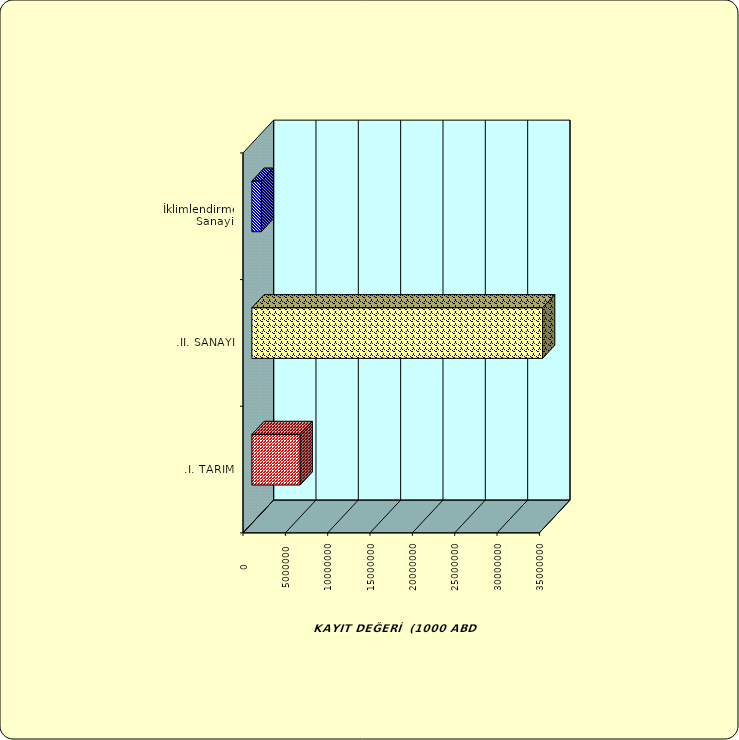
| Category | Series 0 |
|---|---|
| .I. TARIM | 5700156.705 |
| .II. SANAYİ | 34332482.838 |
|  İklimlendirme Sanayii | 1112357.566 |